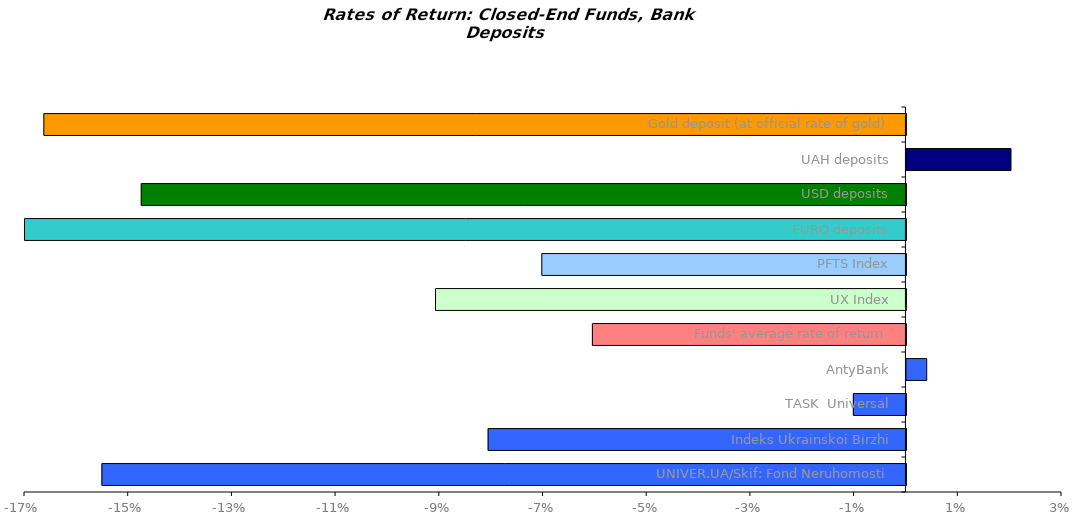
| Category | Series 0 |
|---|---|
| UNIVER.UA/Skif: Fond Neruhomosti | -0.155 |
| Indeks Ukrainskoi Birzhi | -0.081 |
| TASK  Universal | -0.01 |
| AntyBank | 0.004 |
| Funds' average rate of return | -0.06 |
| UX Index | -0.091 |
| PFTS Index | -0.07 |
| EURO deposits | -0.184 |
| USD deposits | -0.147 |
| UAH deposits | 0.02 |
| Gold deposit (at official rate of gold) | -0.166 |